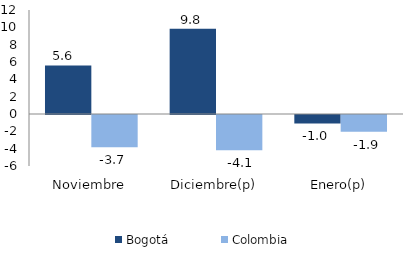
| Category | Bogotá | Colombia |
|---|---|---|
| Noviembre | 5.604 | -3.724 |
| Diciembre(p) | 9.832 | -4.058 |
| Enero(p) | -0.969 | -1.945 |